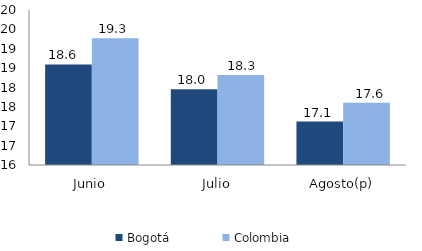
| Category | Bogotá | Colombia |
|---|---|---|
| Junio | 18.595 | 19.269 |
| Julio | 17.957 | 18.322 |
| Agosto(p) | 17.12 | 17.603 |